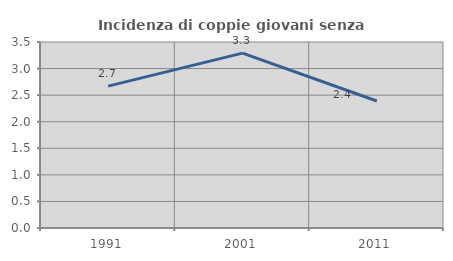
| Category | Incidenza di coppie giovani senza figli |
|---|---|
| 1991.0 | 2.669 |
| 2001.0 | 3.291 |
| 2011.0 | 2.389 |